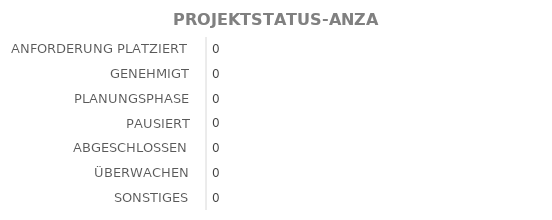
| Category | MENGE |
|---|---|
| ANFORDERUNG PLATZIERT | 0 |
| GENEHMIGT | 0 |
| PLANUNGSPHASE | 0 |
| PAUSIERT | 0 |
| ABGESCHLOSSEN | 0 |
| ÜBERWACHEN | 0 |
| SONSTIGES | 0 |